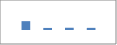
| Category | Data2 |
|---|---|
| 0 | 236 |
| 1 | 55 |
| 2 | 60 |
| 3 | 57 |